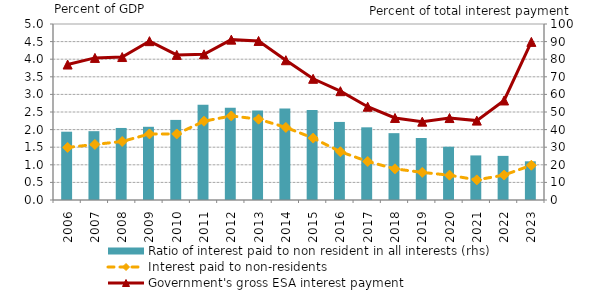
| Category | Ratio of interest paid to non resident in all interests (rhs) |
|---|---|
| 2006.0 | 38.81 |
| 2007.0 | 39.109 |
| 2008.0 | 40.932 |
| 2009.0 | 41.598 |
| 2010.0 | 45.514 |
| 2011.0 | 54.073 |
| 2012.0 | 52.429 |
| 2013.0 | 50.814 |
| 2014.0 | 51.926 |
| 2015.0 | 51.086 |
| 2016.0 | 44.357 |
| 2017.0 | 41.296 |
| 2018.0 | 37.98 |
| 2019.0 | 35.24 |
| 2020.0 | 30.277 |
| 2021.0 | 25.326 |
| 2022.0 | 25.069 |
| 2023.0 | 21.988 |